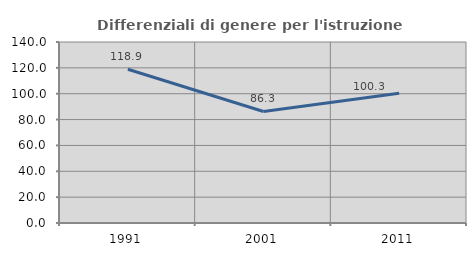
| Category | Differenziali di genere per l'istruzione superiore |
|---|---|
| 1991.0 | 118.889 |
| 2001.0 | 86.286 |
| 2011.0 | 100.301 |